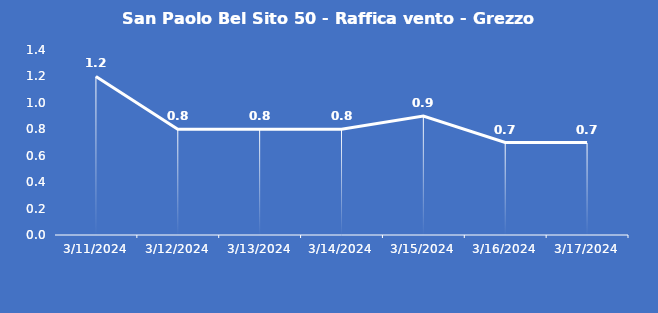
| Category | San Paolo Bel Sito 50 - Raffica vento - Grezzo (m/s) |
|---|---|
| 3/11/24 | 1.2 |
| 3/12/24 | 0.8 |
| 3/13/24 | 0.8 |
| 3/14/24 | 0.8 |
| 3/15/24 | 0.9 |
| 3/16/24 | 0.7 |
| 3/17/24 | 0.7 |